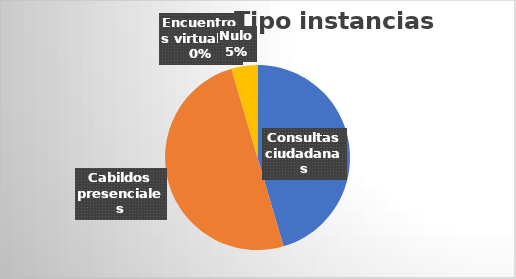
| Category | Series 0 |
|---|---|
| Consultas ciudadanas | 10 |
| Cabildos presenciales | 11 |
| Encuentros virtuales | 0 |
| Nulo | 1 |